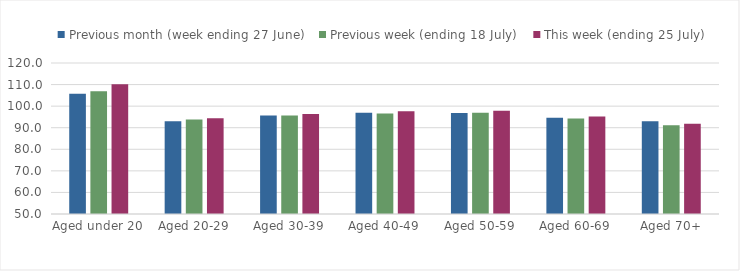
| Category | Previous month (week ending 27 June) | Previous week (ending 18 July) | This week (ending 25 July) |
|---|---|---|---|
| Aged under 20 | 105.74 | 106.864 | 110.188 |
| Aged 20-29 | 92.954 | 93.766 | 94.339 |
| Aged 30-39 | 95.667 | 95.669 | 96.409 |
| Aged 40-49 | 96.966 | 96.585 | 97.632 |
| Aged 50-59 | 96.798 | 96.887 | 97.844 |
| Aged 60-69 | 94.67 | 94.214 | 95.153 |
| Aged 70+ | 93.02 | 91.128 | 91.837 |